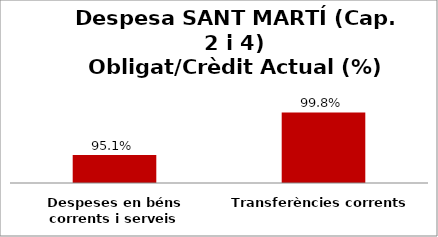
| Category | Series 0 |
|---|---|
| Despeses en béns corrents i serveis | 0.951 |
| Transferències corrents | 0.998 |